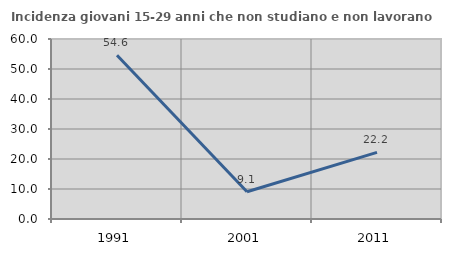
| Category | Incidenza giovani 15-29 anni che non studiano e non lavorano  |
|---|---|
| 1991.0 | 54.575 |
| 2001.0 | 9.091 |
| 2011.0 | 22.222 |